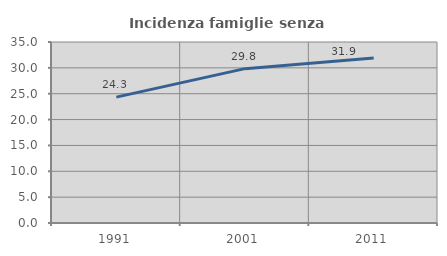
| Category | Incidenza famiglie senza nuclei |
|---|---|
| 1991.0 | 24.346 |
| 2001.0 | 29.847 |
| 2011.0 | 31.888 |